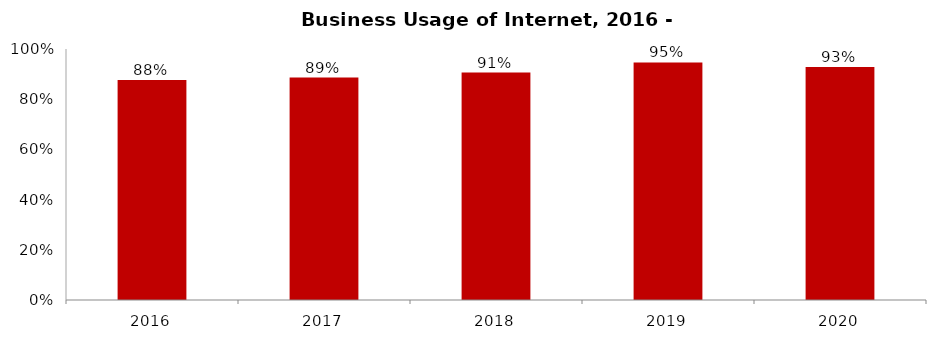
| Category | Business Usage of Internet |
|---|---|
| 2016.0 | 0.876 |
| 2017.0 | 0.886 |
| 2018.0 | 0.906 |
| 2019.0 | 0.946 |
| 2020.0 | 0.928 |